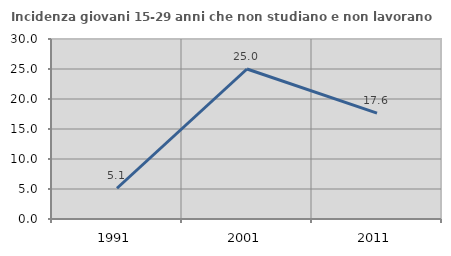
| Category | Incidenza giovani 15-29 anni che non studiano e non lavorano  |
|---|---|
| 1991.0 | 5.128 |
| 2001.0 | 25 |
| 2011.0 | 17.647 |